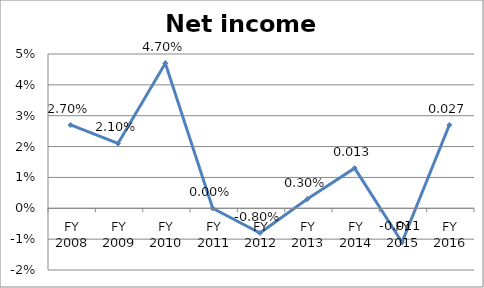
| Category | Net income ratio |
|---|---|
| FY 2016 | 0.027 |
| FY 2015 | -0.011 |
| FY 2014 | 0.013 |
| FY 2013 | 0.003 |
| FY 2012 | -0.008 |
| FY 2011 | 0 |
| FY 2010 | 0.047 |
| FY 2009 | 0.021 |
| FY 2008 | 0.027 |